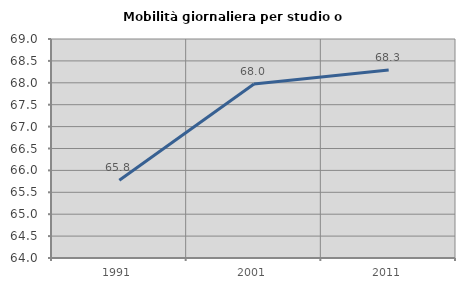
| Category | Mobilità giornaliera per studio o lavoro |
|---|---|
| 1991.0 | 65.777 |
| 2001.0 | 67.97 |
| 2011.0 | 68.293 |